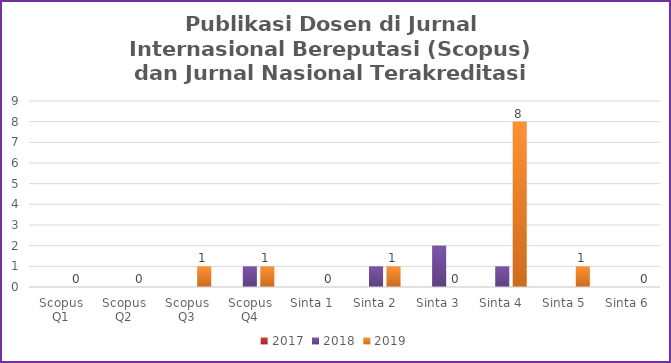
| Category | 2017 | 2018 | 2019 |
|---|---|---|---|
| Scopus Q1 | 0 | 0 | 0 |
| Scopus Q2 | 0 | 0 | 0 |
| Scopus Q3 | 0 | 0 | 1 |
| Scopus Q4 | 0 | 1 | 1 |
| Sinta 1 | 0 | 0 | 0 |
| Sinta 2 | 0 | 1 | 1 |
| Sinta 3 | 0 | 2 | 0 |
| Sinta 4 | 0 | 1 | 8 |
| Sinta 5 | 0 | 0 | 1 |
| Sinta 6 | 0 | 0 | 0 |